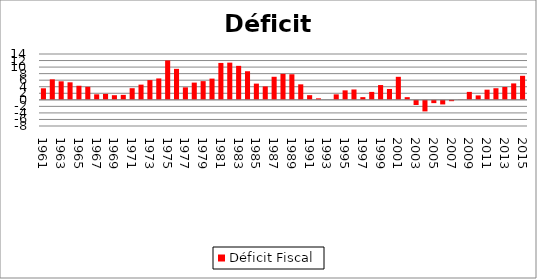
| Category | Déficit Fiscal |
|---|---|
| 1961.0 | 3.52 |
| 1962.0 | 6.26 |
| 1963.0 | 5.65 |
| 1964.0 | 5.35 |
| 1965.0 | 4.3 |
| 1966.0 | 3.98 |
| 1967.0 | 1.68 |
| 1968.0 | 1.8 |
| 1969.0 | 1.41 |
| 1970.0 | 1.51 |
| 1971.0 | 3.55 |
| 1972.0 | 4.64 |
| 1973.0 | 6.02 |
| 1974.0 | 6.53 |
| 1975.0 | 12.03 |
| 1976.0 | 9.46 |
| 1977.0 | 3.81 |
| 1978.0 | 5.26 |
| 1979.0 | 5.71 |
| 1980.0 | 6.48 |
| 1981.0 | 11.27 |
| 1982.0 | 11.36 |
| 1983.0 | 10.38 |
| 1984.0 | 8.73 |
| 1985.0 | 4.95 |
| 1986.0 | 4.09 |
| 1987.0 | 7.04 |
| 1988.0 | 7.93 |
| 1989.0 | 7.81 |
| 1990.0 | 4.73 |
| 1991.0 | 1.42 |
| 1992.0 | 0.45 |
| 1993.0 | 0.01 |
| 1994.0 | 1.67 |
| 1995.0 | 2.89 |
| 1996.0 | 3.16 |
| 1997.0 | 0.82 |
| 1998.0 | 2.42 |
| 1999.0 | 4.51 |
| 2000.0 | 3.3 |
| 2001.0 | 7.03 |
| 2002.0 | 0.81 |
| 2003.0 | -1.59 |
| 2004.0 | -3.54 |
| 2005.0 | -1.01 |
| 2006.0 | -1.41 |
| 2007.0 | -0.417 |
| 2008.0 | -0.06 |
| 2009.0 | 2.422 |
| 2010.0 | 1.35 |
| 2011.0 | 3.101 |
| 2012.0 | 3.539 |
| 2013.0 | 3.92 |
| 2014.0 | 5.014 |
| 2015.0 | 7.336 |